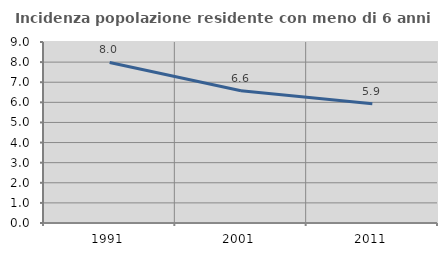
| Category | Incidenza popolazione residente con meno di 6 anni |
|---|---|
| 1991.0 | 7.984 |
| 2001.0 | 6.572 |
| 2011.0 | 5.929 |